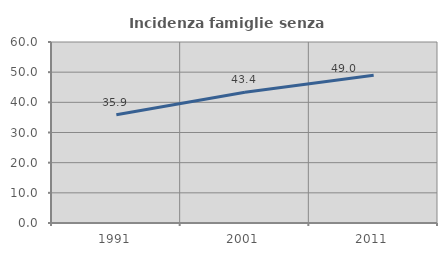
| Category | Incidenza famiglie senza nuclei |
|---|---|
| 1991.0 | 35.863 |
| 2001.0 | 43.371 |
| 2011.0 | 48.971 |